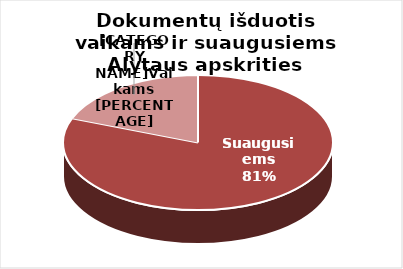
| Category | Series 0 |
|---|---|
| Suaugusiems | 519543 |